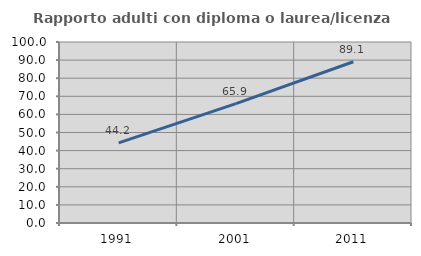
| Category | Rapporto adulti con diploma o laurea/licenza media  |
|---|---|
| 1991.0 | 44.248 |
| 2001.0 | 65.942 |
| 2011.0 | 89.103 |